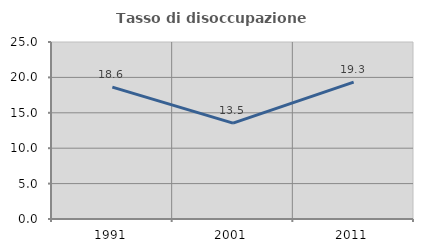
| Category | Tasso di disoccupazione giovanile  |
|---|---|
| 1991.0 | 18.622 |
| 2001.0 | 13.546 |
| 2011.0 | 19.342 |